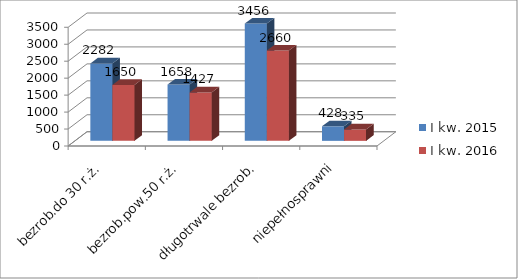
| Category | I kw. 2015 | I kw. 2016 |
|---|---|---|
| bezrob.do 30 r.ż. | 2282 | 1650 |
| bezrob.pow.50 r.ż. | 1658 | 1427 |
| długotrwale bezrob. | 3456 | 2660 |
| niepełnosprawni | 428 | 335 |